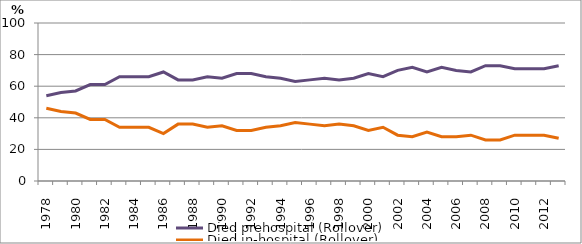
| Category | Died prehospital (Rollover) | Died in-hospital (Rollover) |
|---|---|---|
| 1978.0 | 54 | 46 |
| 1979.0 | 56 | 44 |
| 1980.0 | 57 | 43 |
| 1981.0 | 61 | 39 |
| 1982.0 | 61 | 39 |
| 1983.0 | 66 | 34 |
| 1984.0 | 66 | 34 |
| 1985.0 | 66 | 34 |
| 1986.0 | 69 | 30 |
| 1987.0 | 64 | 36 |
| 1988.0 | 64 | 36 |
| 1989.0 | 66 | 34 |
| 1990.0 | 65 | 35 |
| 1991.0 | 68 | 32 |
| 1992.0 | 68 | 32 |
| 1993.0 | 66 | 34 |
| 1994.0 | 65 | 35 |
| 1995.0 | 63 | 37 |
| 1996.0 | 64 | 36 |
| 1997.0 | 65 | 35 |
| 1998.0 | 64 | 36 |
| 1999.0 | 65 | 35 |
| 2000.0 | 68 | 32 |
| 2001.0 | 66 | 34 |
| 2002.0 | 70 | 29 |
| 2003.0 | 72 | 28 |
| 2004.0 | 69 | 31 |
| 2005.0 | 72 | 28 |
| 2006.0 | 70 | 28 |
| 2007.0 | 69 | 29 |
| 2008.0 | 73 | 26 |
| 2009.0 | 73 | 26 |
| 2010.0 | 71 | 29 |
| 2011.0 | 71 | 29 |
| 2012.0 | 71 | 29 |
| 2013.0 | 73 | 27 |